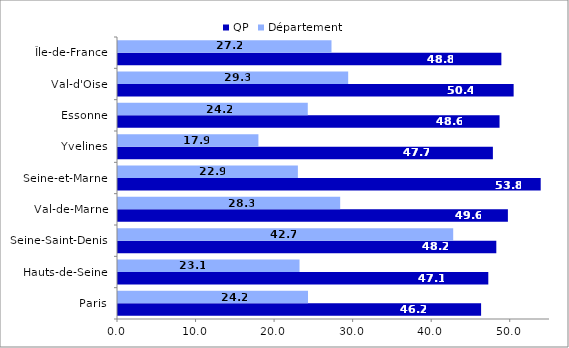
| Category | QP | Département |
|---|---|---|
| Paris | 46.227 | 24.191 |
| Hauts-de-Seine | 47.145 | 23.112 |
| Seine-Saint-Denis | 48.164 | 42.675 |
| Val-de-Marne | 49.638 | 28.287 |
| Seine-et-Marne | 53.816 | 22.902 |
| Yvelines | 47.729 | 17.876 |
| Essonne | 48.576 | 24.161 |
| Val-d'Oise | 50.371 | 29.307 |
| Île-de-France | 48.808 | 27.18 |